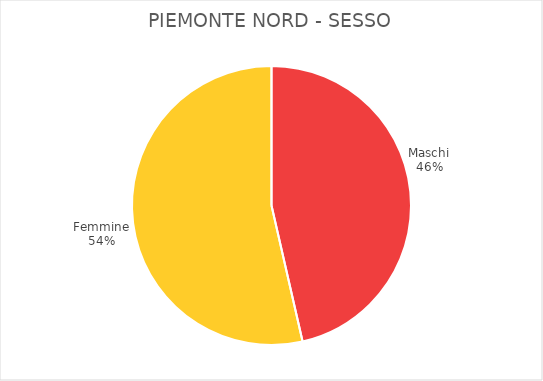
| Category | Piemonte Nord |
|---|---|
| Maschi | 6464 |
| Femmine | 7461 |